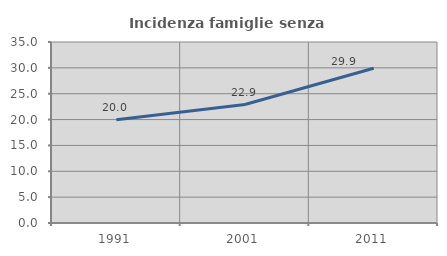
| Category | Incidenza famiglie senza nuclei |
|---|---|
| 1991.0 | 19.962 |
| 2001.0 | 22.911 |
| 2011.0 | 29.917 |